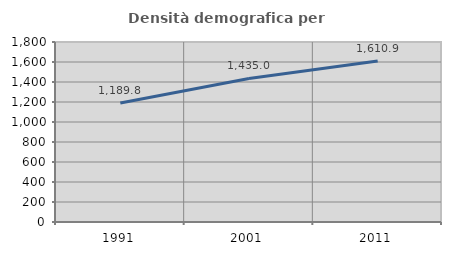
| Category | Densità demografica |
|---|---|
| 1991.0 | 1189.755 |
| 2001.0 | 1435.04 |
| 2011.0 | 1610.878 |